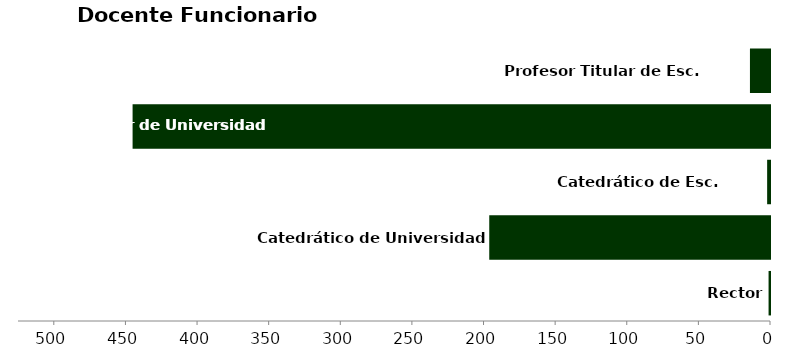
| Category | Series 3 |
|---|---|
| Rector | 1 |
| Catedrático de Universidad | 196 |
| Catedrático de Esc. Universitaria | 2 |
| Profesor Titular de Universidad | 445 |
| Profesor Titular de Esc. Universitaria | 14 |